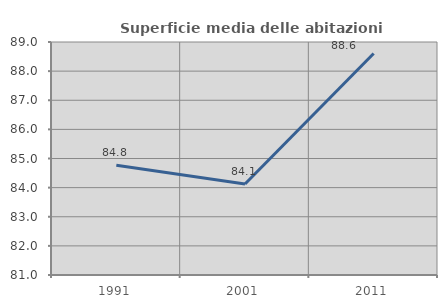
| Category | Superficie media delle abitazioni occupate |
|---|---|
| 1991.0 | 84.769 |
| 2001.0 | 84.127 |
| 2011.0 | 88.607 |